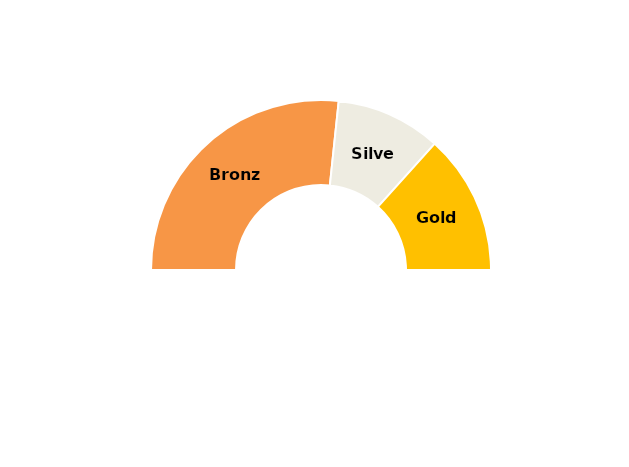
| Category | Series 0 |
|---|---|
| Start | 0 |